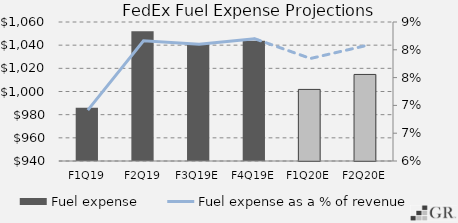
| Category | Fuel expense |
|---|---|
|  F1Q19  | 986 |
|  F2Q19  | 1052 |
|  F3Q19E  | 1041.784 |
|  F4Q19E  | 1043.729 |
|  F1Q20E  | 1001.797 |
|  F2Q20E  | 1014.73 |